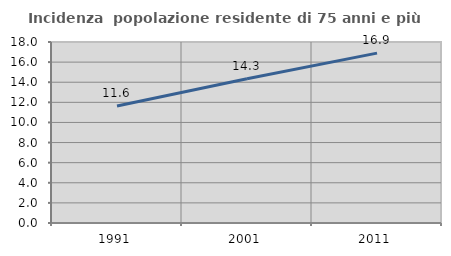
| Category | Incidenza  popolazione residente di 75 anni e più |
|---|---|
| 1991.0 | 11.631 |
| 2001.0 | 14.339 |
| 2011.0 | 16.893 |